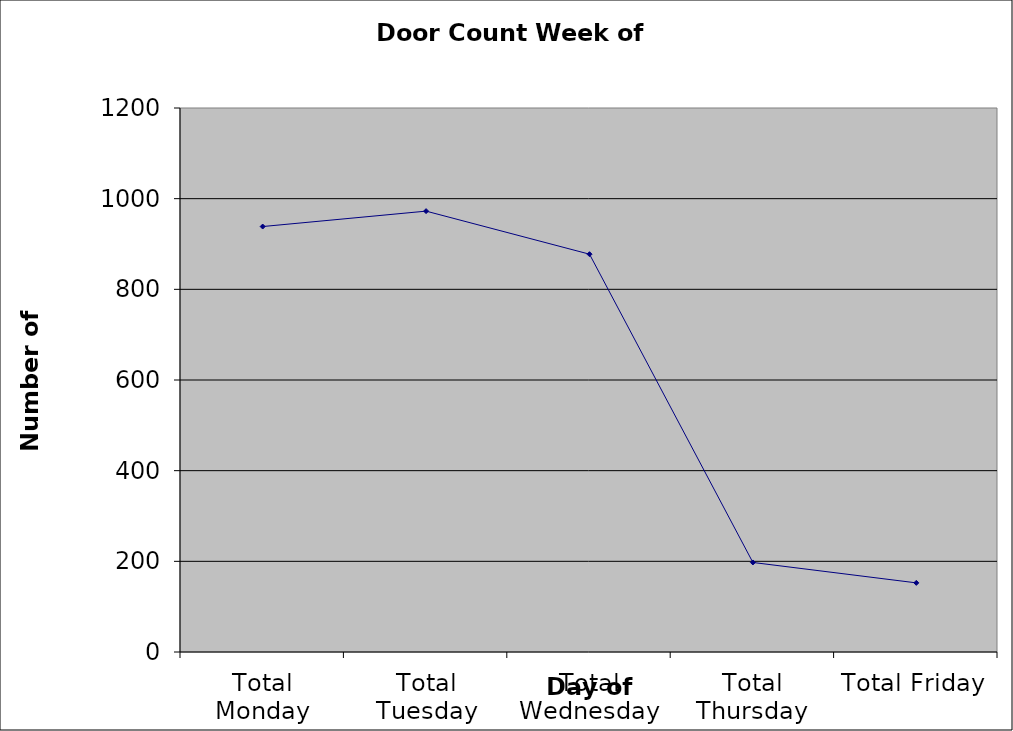
| Category | Series 0 |
|---|---|
| Total Monday | 938.5 |
| Total Tuesday | 972.5 |
| Total Wednesday | 877.5 |
| Total Thursday | 197.5 |
| Total Friday | 152.5 |